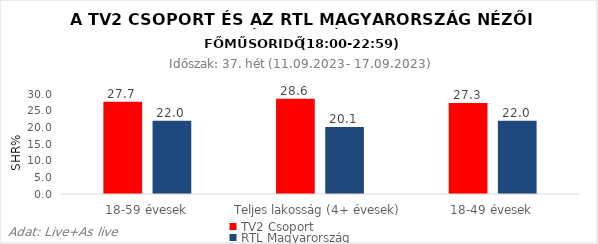
| Category | TV2 Csoport | RTL Magyarország |
|---|---|---|
| 18-59 évesek | 27.7 | 22 |
| Teljes lakosság (4+ évesek) | 28.6 | 20.1 |
| 18-49 évesek | 27.3 | 22 |